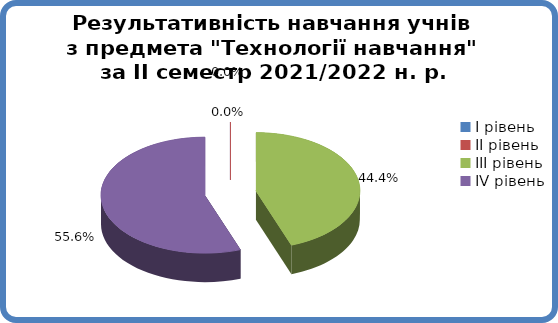
| Category | Series 0 |
|---|---|
| 0 | 0 |
| 1 | 0 |
| 2 | 0.444 |
| 3 | 0.556 |